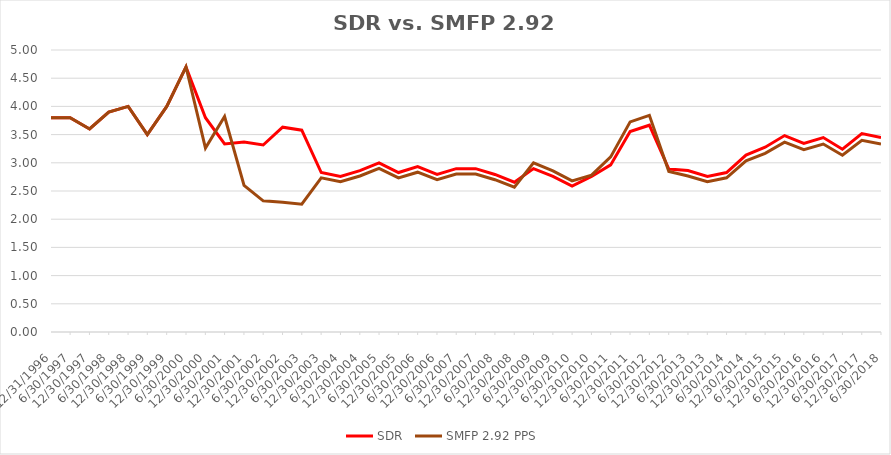
| Category | SDR | SMFP 2.92 PPS |
|---|---|---|
| 12/31/96 | 3.8 | 3.8 |
| 6/30/97 | 3.8 | 3.8 |
| 12/31/97 | 3.6 | 3.6 |
| 6/30/98 | 3.9 | 3.9 |
| 12/31/98 | 4 | 4 |
| 6/30/99 | 3.5 | 3.5 |
| 12/31/99 | 4 | 4 |
| 6/30/00 | 4.7 | 4.7 |
| 12/31/00 | 3.8 | 3.261 |
| 6/30/01 | 3.333 | 3.821 |
| 12/31/01 | 3.368 | 2.6 |
| 6/30/02 | 3.316 | 2.325 |
| 12/31/02 | 3.632 | 2.3 |
| 6/30/03 | 3.579 | 2.267 |
| 12/31/03 | 2.828 | 2.733 |
| 6/30/04 | 2.759 | 2.667 |
| 12/31/04 | 2.862 | 2.767 |
| 6/30/05 | 3 | 2.9 |
| 12/31/05 | 2.828 | 2.733 |
| 6/30/06 | 2.931 | 2.833 |
| 12/31/06 | 2.793 | 2.7 |
| 6/30/07 | 2.897 | 2.8 |
| 12/31/07 | 2.897 | 2.8 |
| 6/30/08 | 2.793 | 2.7 |
| 12/31/08 | 2.655 | 2.567 |
| 6/30/09 | 2.897 | 3 |
| 12/31/09 | 2.759 | 2.857 |
| 6/30/10 | 2.586 | 2.679 |
| 12/31/10 | 2.759 | 2.781 |
| 6/30/11 | 2.963 | 3.105 |
| 12/31/11 | 3.556 | 3.726 |
| 6/30/12 | 3.667 | 3.842 |
| 12/31/12 | 2.889 | 2.847 |
| 6/30/13 | 2.862 | 2.767 |
| 12/31/13 | 2.759 | 2.667 |
| 6/30/14 | 2.828 | 2.733 |
| 12/31/14 | 3.138 | 3.033 |
| 6/30/15 | 3.276 | 3.167 |
| 12/31/15 | 3.483 | 3.367 |
| 6/30/16 | 3.345 | 3.233 |
| 12/31/16 | 3.448 | 3.333 |
| 6/30/17 | 3.241 | 3.133 |
| 12/31/17 | 3.517 | 3.4 |
| 6/30/18 | 3.448 | 3.333 |